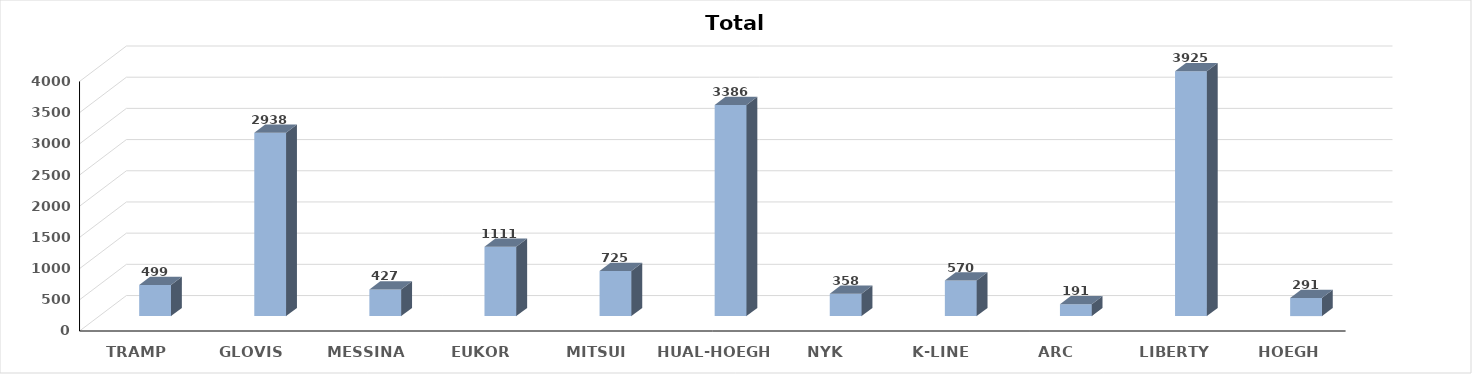
| Category | Series 0 |
|---|---|
| TRAMP | 499 |
| GLOVIS | 2938 |
| MESSINA | 427 |
| EUKOR | 1111 |
| MITSUI | 725 |
| HUAL-HOEGH | 3386 |
| NYK | 358 |
| K-LINE | 570 |
| ARC | 191 |
| LIBERTY GLOBA | 3925 |
| HOEGH AUTOLIN | 291 |